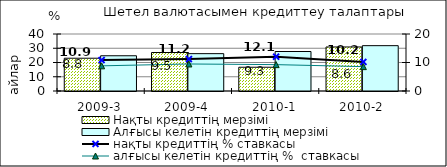
| Category | Нақты кредиттің мерзімі  | Алғысы келетін кредиттің мерзімі  |
|---|---|---|
| 2009-3 | 23 | 24.73 |
| 2009-4 | 27 | 26.21 |
| 2010-1 | 16.67 | 27.71 |
| 2010-2 | 30.89 | 31.82 |